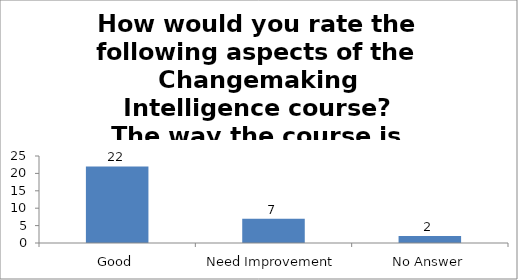
| Category | How would you rate the following aspects of the Changemaking Intelligence course?
The way the course is carried out. |
|---|---|
| Good | 22 |
| Need Improvement | 7 |
| No Answer | 2 |